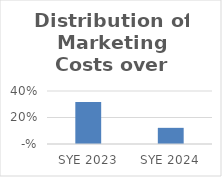
| Category | Series 0 |
|---|---|
| 2023.0 | 0.317 |
| 2024.0 | 0.122 |